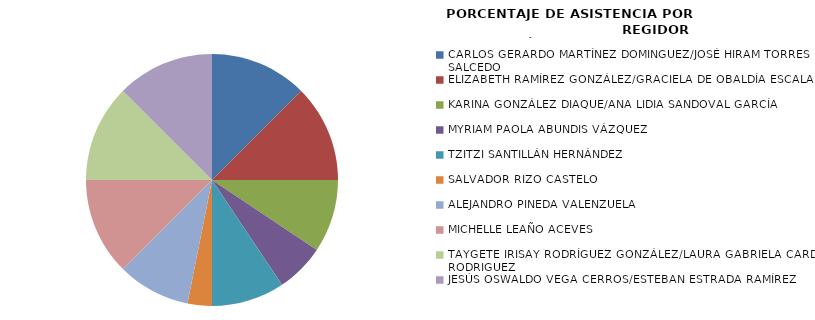
| Category | Series 0 |
|---|---|
| CARLOS GERARDO MARTÍNEZ DOMINGUEZ/JOSÉ HIRAM TORRES SALCEDO | 100 |
| ELIZABETH RAMÍREZ GONZÁLEZ/GRACIELA DE OBALDÍA ESCALANTE | 100 |
| KARINA GONZÁLEZ DIAQUE/ANA LIDIA SANDOVAL GARCÍA | 75 |
| MYRIAM PAOLA ABUNDIS VÁZQUEZ | 50 |
| TZITZI SANTILLÁN HERNÁNDEZ | 75 |
| SALVADOR RIZO CASTELO | 25 |
| ALEJANDRO PINEDA VALENZUELA | 75 |
| MICHELLE LEAÑO ACEVES | 100 |
| TAYGETE IRISAY RODRÍGUEZ GONZÁLEZ/LAURA GABRIELA CARDENAS RODRIGUEZ | 100 |
| JESÚS OSWALDO VEGA CERROS/ESTEBAN ESTRADA RAMÍREZ | 100 |